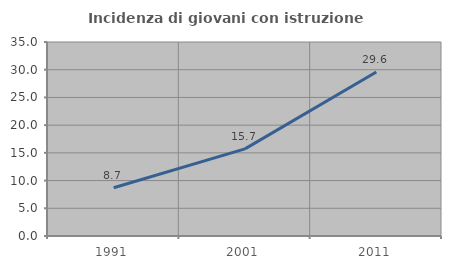
| Category | Incidenza di giovani con istruzione universitaria |
|---|---|
| 1991.0 | 8.711 |
| 2001.0 | 15.717 |
| 2011.0 | 29.586 |